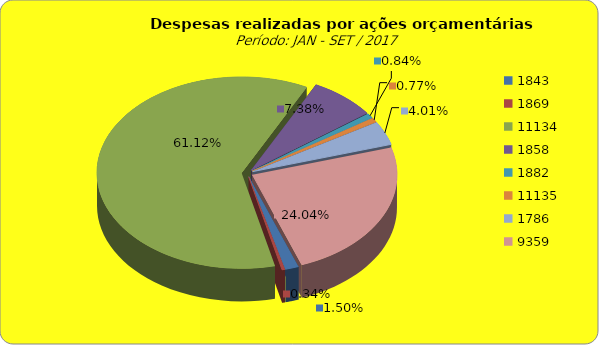
| Category | Series 1 |
|---|---|
| 1843.0 | 2928667.57 |
| 1869.0 | 663995.72 |
| 11134.0 | 118986753.33 |
| 1858.0 | 14356985.98 |
| 1882.0 | 1631451.26 |
| 11135.0 | 1489390.11 |
| 1786.0 | 7800390.44 |
| 9359.0 | 46806489.21 |